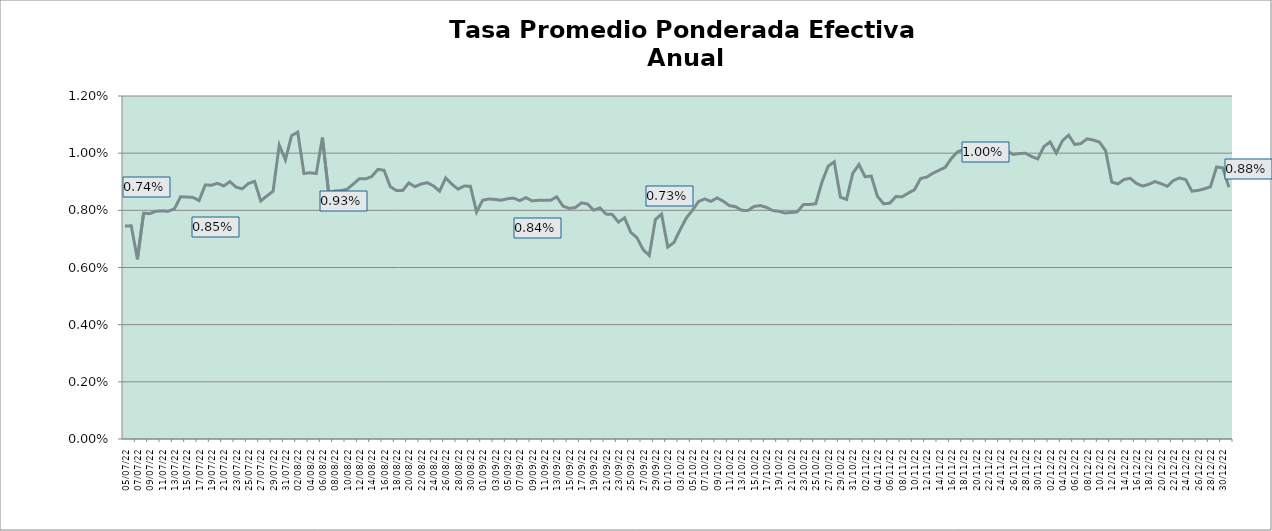
| Category | Tasa Efectiva Anual |
|---|---|
| 2022-07-05 | 0.007 |
| 2022-07-06 | 0.007 |
| 2022-07-07 | 0.006 |
| 2022-07-08 | 0.008 |
| 2022-07-09 | 0.008 |
| 2022-07-10 | 0.008 |
| 2022-07-11 | 0.008 |
| 2022-07-12 | 0.008 |
| 2022-07-13 | 0.008 |
| 2022-07-14 | 0.008 |
| 2022-07-15 | 0.008 |
| 2022-07-16 | 0.008 |
| 2022-07-17 | 0.008 |
| 2022-07-18 | 0.009 |
| 2022-07-19 | 0.009 |
| 2022-07-20 | 0.009 |
| 2022-07-21 | 0.009 |
| 2022-07-22 | 0.009 |
| 2022-07-23 | 0.009 |
| 2022-07-24 | 0.009 |
| 2022-07-25 | 0.009 |
| 2022-07-26 | 0.009 |
| 2022-07-27 | 0.008 |
| 2022-07-28 | 0.009 |
| 2022-07-29 | 0.009 |
| 2022-07-30 | 0.01 |
| 2022-07-31 | 0.01 |
| 2022-08-01 | 0.011 |
| 2022-08-02 | 0.011 |
| 2022-08-03 | 0.009 |
| 2022-08-04 | 0.009 |
| 2022-08-05 | 0.009 |
| 2022-08-06 | 0.011 |
| 2022-08-07 | 0.009 |
| 2022-08-08 | 0.009 |
| 2022-08-09 | 0.009 |
| 2022-08-10 | 0.009 |
| 2022-08-11 | 0.009 |
| 2022-08-12 | 0.009 |
| 2022-08-13 | 0.009 |
| 2022-08-14 | 0.009 |
| 2022-08-15 | 0.009 |
| 2022-08-16 | 0.009 |
| 2022-08-17 | 0.009 |
| 2022-08-18 | 0.009 |
| 2022-08-19 | 0.009 |
| 2022-08-20 | 0.009 |
| 2022-08-21 | 0.009 |
| 2022-08-22 | 0.009 |
| 2022-08-23 | 0.009 |
| 2022-08-24 | 0.009 |
| 2022-08-25 | 0.009 |
| 2022-08-26 | 0.009 |
| 2022-08-27 | 0.009 |
| 2022-08-28 | 0.009 |
| 2022-08-29 | 0.009 |
| 2022-08-30 | 0.009 |
| 2022-08-31 | 0.008 |
| 2022-09-01 | 0.008 |
| 2022-09-02 | 0.008 |
| 2022-09-03 | 0.008 |
| 2022-09-04 | 0.008 |
| 2022-09-05 | 0.008 |
| 2022-09-06 | 0.008 |
| 2022-09-07 | 0.008 |
| 2022-09-08 | 0.008 |
| 2022-09-09 | 0.008 |
| 2022-09-10 | 0.008 |
| 2022-09-11 | 0.008 |
| 2022-09-12 | 0.008 |
| 2022-09-13 | 0.008 |
| 2022-09-14 | 0.008 |
| 2022-09-15 | 0.008 |
| 2022-09-16 | 0.008 |
| 2022-09-17 | 0.008 |
| 2022-09-18 | 0.008 |
| 2022-09-19 | 0.008 |
| 2022-09-20 | 0.008 |
| 2022-09-21 | 0.008 |
| 2022-09-22 | 0.008 |
| 2022-09-23 | 0.008 |
| 2022-09-24 | 0.008 |
| 2022-09-25 | 0.007 |
| 2022-09-26 | 0.007 |
| 2022-09-27 | 0.007 |
| 2022-09-28 | 0.006 |
| 2022-09-29 | 0.008 |
| 2022-09-30 | 0.008 |
| 2022-10-01 | 0.007 |
| 2022-10-02 | 0.007 |
| 2022-10-03 | 0.007 |
| 2022-10-04 | 0.008 |
| 2022-10-05 | 0.008 |
| 2022-10-06 | 0.008 |
| 2022-10-07 | 0.008 |
| 2022-10-08 | 0.008 |
| 2022-10-09 | 0.008 |
| 2022-10-10 | 0.008 |
| 2022-10-11 | 0.008 |
| 2022-10-12 | 0.008 |
| 2022-10-13 | 0.008 |
| 2022-10-14 | 0.008 |
| 2022-10-15 | 0.008 |
| 2022-10-16 | 0.008 |
| 2022-10-17 | 0.008 |
| 2022-10-18 | 0.008 |
| 2022-10-19 | 0.008 |
| 2022-10-20 | 0.008 |
| 2022-10-21 | 0.008 |
| 2022-10-22 | 0.008 |
| 2022-10-23 | 0.008 |
| 2022-10-24 | 0.008 |
| 2022-10-25 | 0.008 |
| 2022-10-26 | 0.009 |
| 2022-10-27 | 0.01 |
| 2022-10-28 | 0.01 |
| 2022-10-29 | 0.008 |
| 2022-10-30 | 0.008 |
| 2022-10-31 | 0.009 |
| 2022-11-01 | 0.01 |
| 2022-11-02 | 0.009 |
| 2022-11-03 | 0.009 |
| 2022-11-04 | 0.008 |
| 2022-11-05 | 0.008 |
| 2022-11-06 | 0.008 |
| 2022-11-07 | 0.008 |
| 2022-11-08 | 0.008 |
| 2022-11-09 | 0.009 |
| 2022-11-10 | 0.009 |
| 2022-11-11 | 0.009 |
| 2022-11-12 | 0.009 |
| 2022-11-13 | 0.009 |
| 2022-11-14 | 0.009 |
| 2022-11-15 | 0.01 |
| 2022-11-16 | 0.01 |
| 2022-11-17 | 0.01 |
| 2022-11-18 | 0.01 |
| 2022-11-19 | 0.01 |
| 2022-11-20 | 0.01 |
| 2022-11-21 | 0.01 |
| 2022-11-22 | 0.01 |
| 2022-11-23 | 0.01 |
| 2022-11-24 | 0.01 |
| 2022-11-25 | 0.01 |
| 2022-11-26 | 0.01 |
| 2022-11-27 | 0.01 |
| 2022-11-28 | 0.01 |
| 2022-11-29 | 0.01 |
| 2022-11-30 | 0.01 |
| 2022-12-01 | 0.01 |
| 2022-12-02 | 0.01 |
| 2022-12-03 | 0.01 |
| 2022-12-04 | 0.01 |
| 2022-12-05 | 0.011 |
| 2022-12-06 | 0.01 |
| 2022-12-07 | 0.01 |
| 2022-12-08 | 0.011 |
| 2022-12-09 | 0.01 |
| 2022-12-10 | 0.01 |
| 2022-12-11 | 0.01 |
| 2022-12-12 | 0.009 |
| 2022-12-13 | 0.009 |
| 2022-12-14 | 0.009 |
| 2022-12-15 | 0.009 |
| 2022-12-16 | 0.009 |
| 2022-12-17 | 0.009 |
| 2022-12-18 | 0.009 |
| 2022-12-19 | 0.009 |
| 2022-12-20 | 0.009 |
| 2022-12-21 | 0.009 |
| 2022-12-22 | 0.009 |
| 2022-12-23 | 0.009 |
| 2022-12-24 | 0.009 |
| 2022-12-25 | 0.009 |
| 2022-12-26 | 0.009 |
| 2022-12-27 | 0.009 |
| 2022-12-28 | 0.009 |
| 2022-12-29 | 0.01 |
| 2022-12-30 | 0.009 |
| 2022-12-31 | 0.009 |